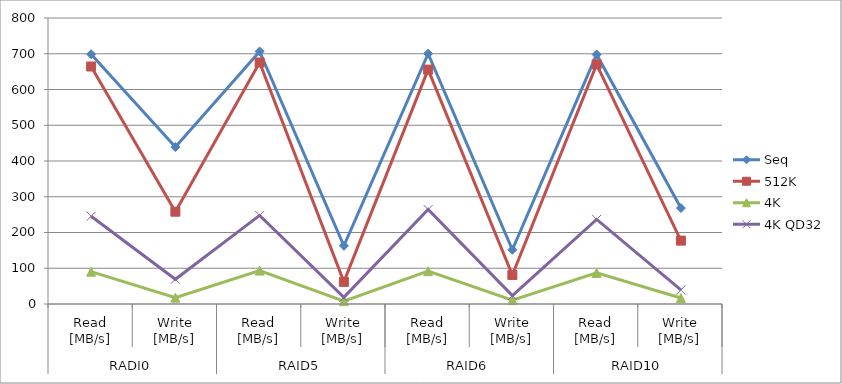
| Category | Seq | 512K | 4K | 4K QD32 |
|---|---|---|---|---|
| 0 | 698.7 | 664.3 | 90.44 | 245.6 |
| 1 | 438.9 | 258.2 | 17.77 | 69.2 |
| 2 | 706.5 | 675.5 | 93.53 | 247.8 |
| 3 | 162.8 | 61.95 | 8.075 | 18.6 |
| 4 | 700.3 | 655.6 | 91.77 | 264.3 |
| 5 | 151.7 | 81.02 | 10.74 | 23.58 |
| 6 | 697.9 | 670.2 | 87.01 | 236.7 |
| 7 | 268.3 | 177.3 | 16.69 | 39.29 |